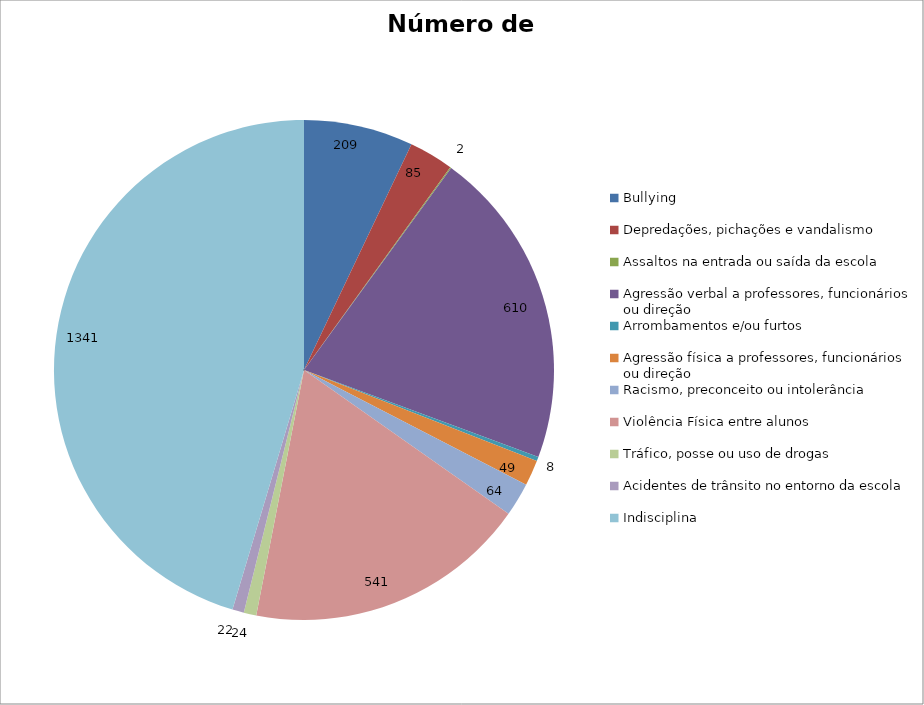
| Category | Número de Casos |
|---|---|
| Bullying | 209 |
| Depredações, pichações e vandalismo | 85 |
| Assaltos na entrada ou saída da escola | 2 |
| Agressão verbal a professores, funcionários ou direção | 610 |
| Arrombamentos e/ou furtos | 8 |
| Agressão física a professores, funcionários ou direção | 49 |
| Racismo, preconceito ou intolerância | 64 |
| Violência Física entre alunos | 541 |
| Tráfico, posse ou uso de drogas | 24 |
| Acidentes de trânsito no entorno da escola | 22 |
| Indisciplina | 1341 |